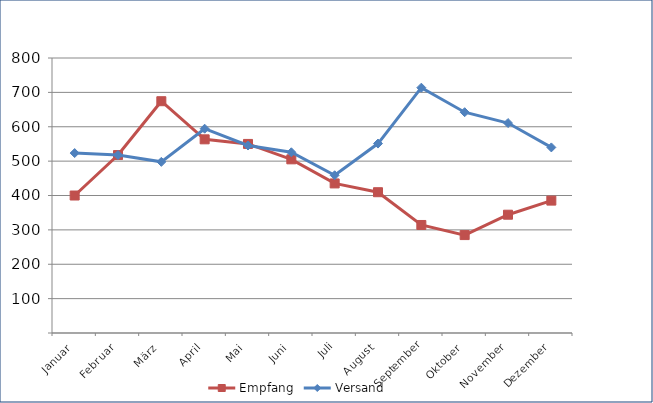
| Category | Empfang | Versand |
|---|---|---|
| Januar | 399.93 | 523.422 |
| Februar | 517.638 | 517.78 |
| März | 674.292 | 497.876 |
| April | 563.4 | 594.331 |
| Mai | 550.014 | 545.4 |
| Juni | 505.212 | 525.709 |
| Juli | 435.108 | 458.907 |
| August | 409.581 | 551.098 |
| September | 314.262 | 713.665 |
| Oktober | 284.82 | 642.362 |
| November | 344.098 | 610.816 |
| Dezember | 385.145 | 539.874 |